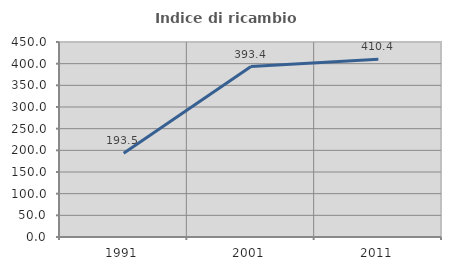
| Category | Indice di ricambio occupazionale  |
|---|---|
| 1991.0 | 193.511 |
| 2001.0 | 393.421 |
| 2011.0 | 410.429 |